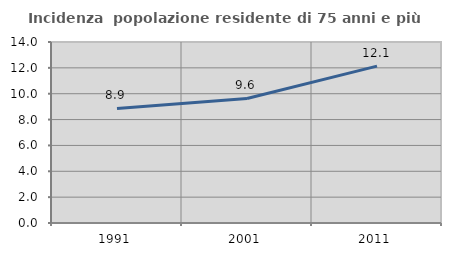
| Category | Incidenza  popolazione residente di 75 anni e più |
|---|---|
| 1991.0 | 8.865 |
| 2001.0 | 9.634 |
| 2011.0 | 12.137 |